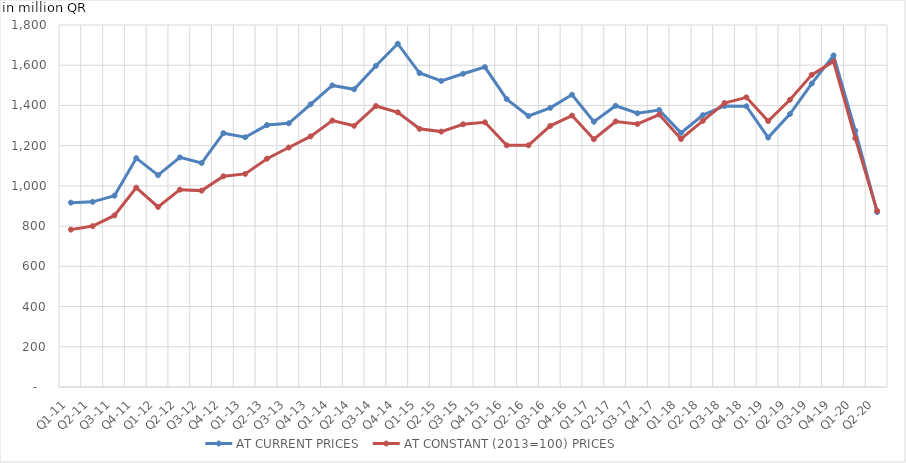
| Category | AT CURRENT PRICES | AT CONSTANT (2013=100) PRICES |
|---|---|---|
| Q1-11 | 916.686 | 782.563 |
| Q2-11 | 920.671 | 800.027 |
| Q3-11 | 951.235 | 853.004 |
| Q4-11 | 1137.735 | 991.197 |
| Q1-12 | 1053.393 | 895.209 |
| Q2-12 | 1141.823 | 981.186 |
| Q3-12 | 1113.724 | 976.459 |
| Q4-12 | 1262.109 | 1047.79 |
| Q1-13 | 1241.801 | 1059.739 |
| Q2-13 | 1302.354 | 1135.308 |
| Q3-13 | 1311.386 | 1190.817 |
| Q4-13 | 1405.68 | 1246.234 |
| Q1-14 | 1499.605 | 1324.838 |
| Q2-14 | 1480.273 | 1298.665 |
| Q3-14 | 1597.151 | 1397.205 |
| Q4-14 | 1707.053 | 1365.863 |
| Q1-15 | 1561.16 | 1283.791 |
| Q2-15 | 1521.675 | 1269.942 |
| Q3-15 | 1557.525 | 1306.279 |
| Q4-15 | 1590.991 | 1316.2 |
| Q1-16 | 1431.49 | 1201.504 |
| Q2-16 | 1347.397 | 1201.862 |
| Q3-16 | 1388.069 | 1298.345 |
| Q4-16 | 1453.38 | 1349.619 |
| Q1-17 | 1318.65 | 1232.073 |
| Q2-17 | 1398.559 | 1320.225 |
| Q3-17 | 1361.137 | 1307.713 |
| Q4-17 | 1377.402 | 1354.785 |
| Q1-18 | 1263.503 | 1233.102 |
| Q2-18 | 1351.676 | 1323.283 |
| Q3-18 | 1397.376 | 1412.058 |
| Q4-18 | 1396.298 | 1440.41 |
| Q1-19 | 1240.508 | 1322.527 |
| Q2-19 | 1357.277 | 1428.466 |
| Q3-19 | 1508.978 | 1551.969 |
| Q4-19 | 1648.542 | 1619.078 |
| Q1-20 | 1274.501 | 1236.373 |
| Q2-20 | 869.844 | 875.942 |